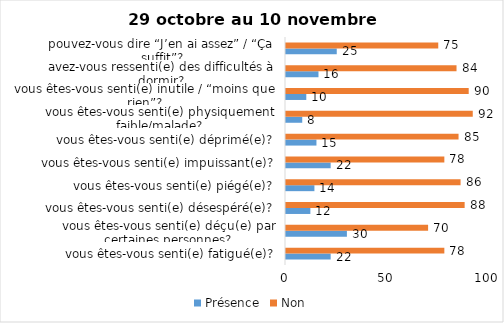
| Category | Présence | Non |
|---|---|---|
| vous êtes-vous senti(e) fatigué(e)? | 22 | 78 |
| vous êtes-vous senti(e) déçu(e) par certaines personnes? | 30 | 70 |
| vous êtes-vous senti(e) désespéré(e)? | 12 | 88 |
| vous êtes-vous senti(e) piégé(e)? | 14 | 86 |
| vous êtes-vous senti(e) impuissant(e)? | 22 | 78 |
| vous êtes-vous senti(e) déprimé(e)? | 15 | 85 |
| vous êtes-vous senti(e) physiquement faible/malade? | 8 | 92 |
| vous êtes-vous senti(e) inutile / “moins que rien”? | 10 | 90 |
| avez-vous ressenti(e) des difficultés à dormir? | 16 | 84 |
| pouvez-vous dire “J’en ai assez” / “Ça suffit”? | 25 | 75 |